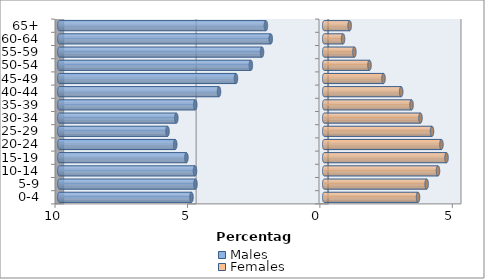
| Category | Males | Females |
|---|---|---|
| 0-4 | -5.011 | 3.542 |
| 5-9 | -4.861 | 3.868 |
| 10-14 | -4.879 | 4.296 |
| 15-19 | -5.203 | 4.617 |
| 20-24 | -5.625 | 4.425 |
| 25-29 | -5.916 | 4.07 |
| 30-34 | -5.583 | 3.634 |
| 35-39 | -4.869 | 3.297 |
| 40-44 | -3.972 | 2.906 |
| 45-49 | -3.331 | 2.238 |
| 50-54 | -2.769 | 1.709 |
| 55-59 | -2.348 | 1.139 |
| 60-64 | -2.019 | 0.712 |
| 65+ | -2.203 | 0.96 |